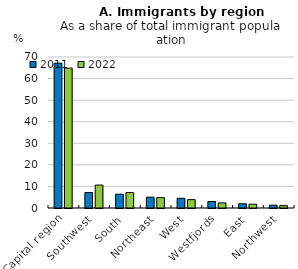
| Category | 2011 | 2022 |
|---|---|---|
| Capital region | 67.129 | 64.857 |
| Southwest | 7.153 | 10.639 |
| South | 6.407 | 7.164 |
| Northeast | 5.017 | 4.817 |
| West | 4.504 | 3.876 |
| Westfjords | 3.012 | 2.374 |
| East | 1.955 | 1.754 |
| Northwest | 1.294 | 1.104 |